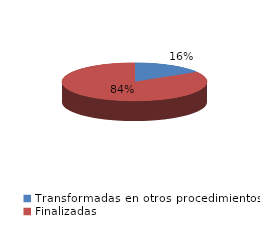
| Category | Series 0 |
|---|---|
| Transformadas en otros procedimientos | 3785 |
| Finalizadas | 19570 |